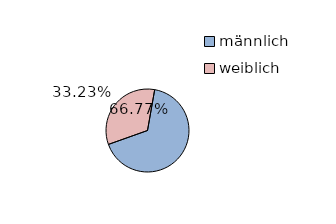
| Category | Series 0 |
|---|---|
| männlich | 66.773 |
| weiblich | 33.227 |